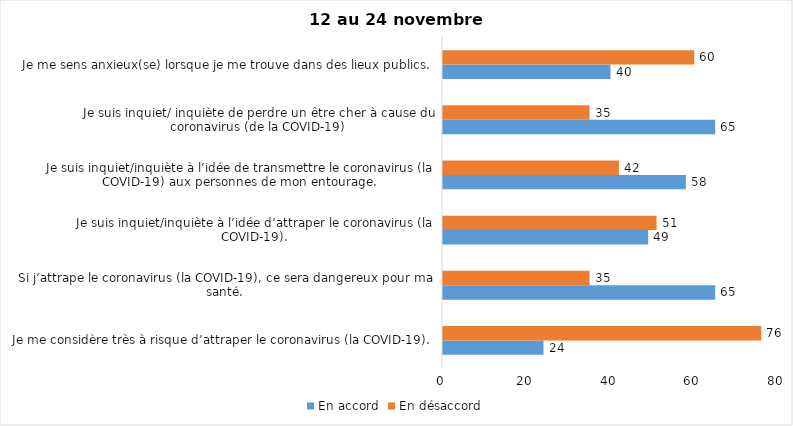
| Category | En accord | En désaccord |
|---|---|---|
| Je me considère très à risque d’attraper le coronavirus (la COVID-19). | 24 | 76 |
| Si j’attrape le coronavirus (la COVID-19), ce sera dangereux pour ma santé. | 65 | 35 |
| Je suis inquiet/inquiète à l’idée d’attraper le coronavirus (la COVID-19). | 49 | 51 |
| Je suis inquiet/inquiète à l’idée de transmettre le coronavirus (la COVID-19) aux personnes de mon entourage. | 58 | 42 |
| Je suis inquiet/ inquiète de perdre un être cher à cause du coronavirus (de la COVID-19) | 65 | 35 |
| Je me sens anxieux(se) lorsque je me trouve dans des lieux publics. | 40 | 60 |